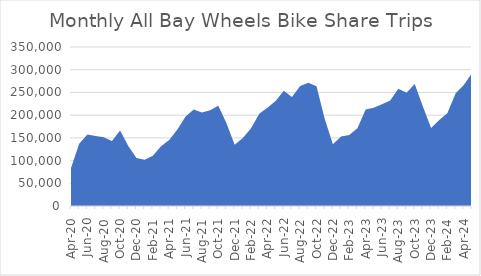
| Category | All Users |
|---|---|
| 2020-04-01 | 83657 |
| 2020-05-01 | 137278 |
| 2020-06-01 | 157173 |
| 2020-07-01 | 154076 |
| 2020-08-01 | 151514 |
| 2020-09-01 | 143252 |
| 2020-10-01 | 166290 |
| 2020-11-01 | 132064 |
| 2020-12-01 | 105689 |
| 2021-01-01 | 101701 |
| 2021-02-01 | 110458 |
| 2021-03-01 | 131292 |
| 2021-04-01 | 145173 |
| 2021-05-01 | 168487 |
| 2021-06-01 | 197225 |
| 2021-07-01 | 212519 |
| 2021-08-01 | 205552 |
| 2021-09-01 | 211026 |
| 2021-10-01 | 220751 |
| 2021-11-01 | 182401 |
| 2021-12-01 | 134738 |
| 2022-01-01 | 149709 |
| 2022-02-01 | 171150 |
| 2022-03-01 | 203136 |
| 2022-04-01 | 216283 |
| 2022-05-01 | 230997 |
| 2022-06-01 | 253789 |
| 2022-07-01 | 240026 |
| 2022-08-01 | 264219 |
| 2022-09-01 | 271184 |
| 2022-10-01 | 263706 |
| 2022-11-01 | 192233 |
| 2022-12-01 | 135656 |
| 2023-01-01 | 153095 |
| 2023-02-01 | 156345 |
| 2023-03-01 | 171326 |
| 2023-04-01 | 212661 |
| 2023-05-01 | 216361 |
| 2023-06-01 | 224215 |
| 2023-07-01 | 232161 |
| 2023-08-01 | 258064 |
| 2023-09-01 | 249037 |
| 2023-10-01 | 268632 |
| 2023-11-01 | 219018 |
| 2023-12-01 | 171835 |
| 2024-01-01 | 189164 |
| 2024-02-01 | 204563 |
| 2024-03-01 | 248185 |
| 2024-04-01 | 266407 |
| 2024-05-01 | 292968 |